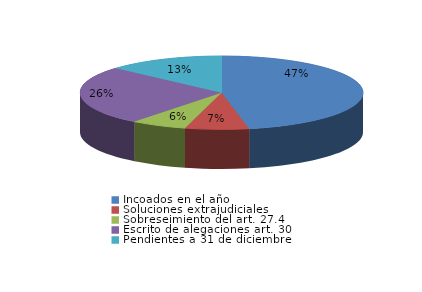
| Category | Series 0 |
|---|---|
| Incoados en el año | 374 |
| Soluciones extrajudiciales | 58 |
| Sobreseimiento del art. 27.4 | 51 |
| Escrito de alegaciones art. 30 | 208 |
| Pendientes a 31 de diciembre | 107 |